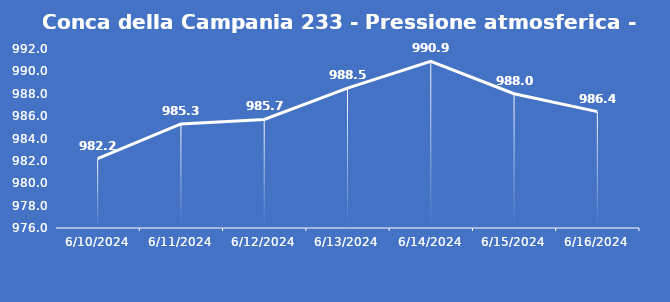
| Category | Conca della Campania 233 - Pressione atmosferica - Grezzo (hPa) |
|---|---|
| 6/10/24 | 982.2 |
| 6/11/24 | 985.3 |
| 6/12/24 | 985.7 |
| 6/13/24 | 988.5 |
| 6/14/24 | 990.9 |
| 6/15/24 | 988 |
| 6/16/24 | 986.4 |